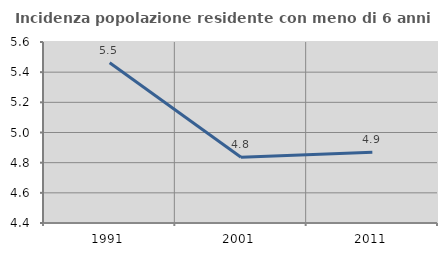
| Category | Incidenza popolazione residente con meno di 6 anni |
|---|---|
| 1991.0 | 5.462 |
| 2001.0 | 4.836 |
| 2011.0 | 4.869 |